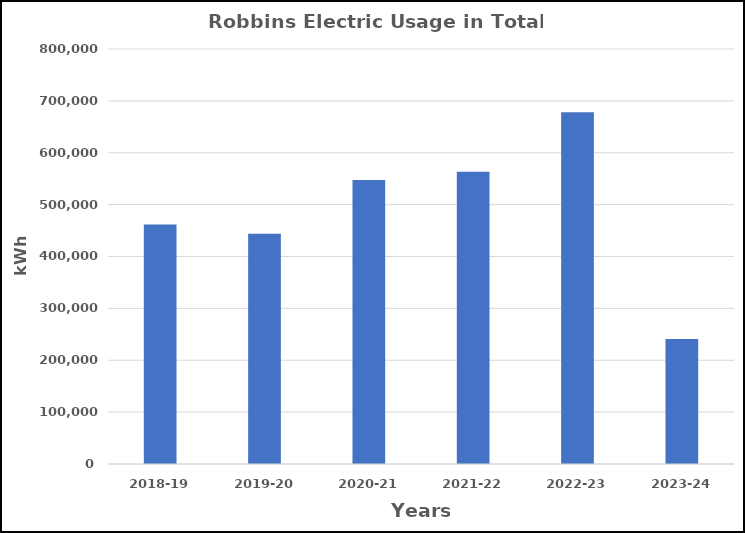
| Category | Series 0 |
|---|---|
| 2018-19 | 461875 |
| 2019-20 | 443763 |
| 2020-21 | 547267 |
| 2021-22 | 563428 |
| 2022-23 | 678203 |
| 2023-24 | 240866 |